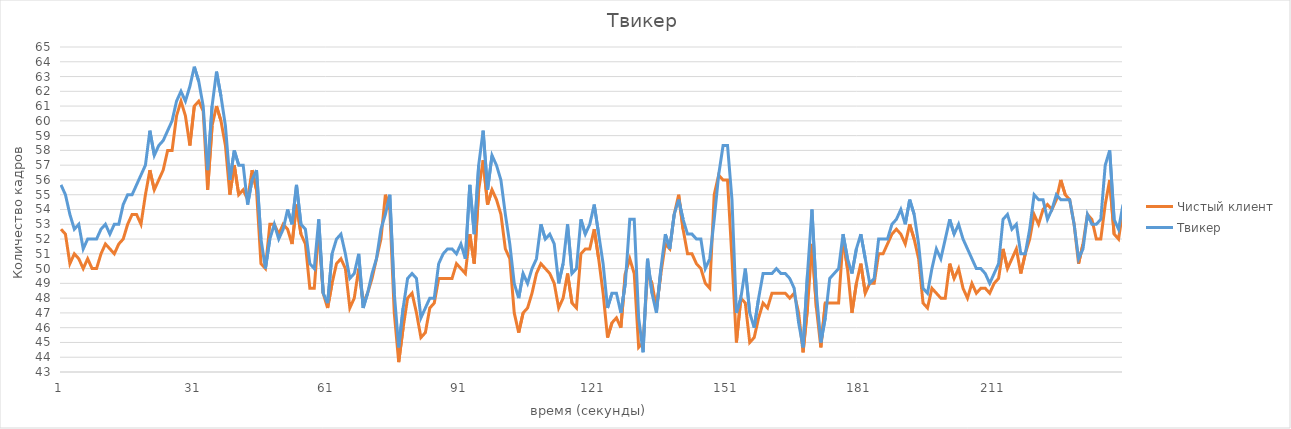
| Category | Чистый клиент | Твикер |
|---|---|---|
| 0 | 52.667 | 55.667 |
| 1 | 52.333 | 55 |
| 2 | 50.333 | 53.667 |
| 3 | 51 | 52.667 |
| 4 | 50.667 | 53 |
| 5 | 50 | 51.333 |
| 6 | 50.667 | 52 |
| 7 | 50 | 52 |
| 8 | 50 | 52 |
| 9 | 51 | 52.667 |
| 10 | 51.667 | 53 |
| 11 | 51.333 | 52.333 |
| 12 | 51 | 53 |
| 13 | 51.667 | 53 |
| 14 | 52 | 54.333 |
| 15 | 53 | 55 |
| 16 | 53.667 | 55 |
| 17 | 53.667 | 55.667 |
| 18 | 53 | 56.333 |
| 19 | 55 | 57 |
| 20 | 56.667 | 59.333 |
| 21 | 55.333 | 57.667 |
| 22 | 56 | 58.333 |
| 23 | 56.667 | 58.667 |
| 24 | 58 | 59.333 |
| 25 | 58 | 60 |
| 26 | 60.333 | 61.333 |
| 27 | 61.333 | 62 |
| 28 | 60.333 | 61.333 |
| 29 | 58.333 | 62.333 |
| 30 | 61 | 63.667 |
| 31 | 61.333 | 62.667 |
| 32 | 60.667 | 61 |
| 33 | 55.333 | 56.667 |
| 34 | 59.667 | 61 |
| 35 | 61 | 63.333 |
| 36 | 60 | 61.667 |
| 37 | 58.333 | 59.667 |
| 38 | 55 | 56 |
| 39 | 57 | 58 |
| 40 | 55 | 57 |
| 41 | 55.333 | 57 |
| 42 | 54.667 | 54.333 |
| 43 | 56.667 | 56 |
| 44 | 55.333 | 56.667 |
| 45 | 50.333 | 52 |
| 46 | 50 | 50 |
| 47 | 53 | 52 |
| 48 | 53 | 53 |
| 49 | 52.333 | 52 |
| 50 | 53 | 52.667 |
| 51 | 52.667 | 54 |
| 52 | 51.667 | 53 |
| 53 | 54.333 | 55.667 |
| 54 | 52.333 | 53 |
| 55 | 51.667 | 52.667 |
| 56 | 48.667 | 50.333 |
| 57 | 48.667 | 50 |
| 58 | 52.667 | 53.333 |
| 59 | 48.333 | 48.333 |
| 60 | 47.333 | 47.667 |
| 61 | 49 | 51 |
| 62 | 50.333 | 52 |
| 63 | 50.667 | 52.333 |
| 64 | 50 | 51 |
| 65 | 47.333 | 49.333 |
| 66 | 48 | 49.667 |
| 67 | 50 | 51 |
| 68 | 47.667 | 47.333 |
| 69 | 48.333 | 48.333 |
| 70 | 49.333 | 49.667 |
| 71 | 50.667 | 50.667 |
| 72 | 52 | 52.667 |
| 73 | 55 | 53.667 |
| 74 | 54 | 55 |
| 75 | 47 | 48.333 |
| 76 | 43.667 | 44.667 |
| 77 | 46 | 47.333 |
| 78 | 48 | 49.333 |
| 79 | 48.333 | 49.667 |
| 80 | 47 | 49.333 |
| 81 | 45.333 | 46.667 |
| 82 | 45.667 | 47.333 |
| 83 | 47.333 | 48 |
| 84 | 47.667 | 48 |
| 85 | 49.333 | 50.333 |
| 86 | 49.333 | 51 |
| 87 | 49.333 | 51.333 |
| 88 | 49.333 | 51.333 |
| 89 | 50.333 | 51 |
| 90 | 50 | 51.667 |
| 91 | 49.667 | 50.667 |
| 92 | 52.333 | 55.667 |
| 93 | 50.333 | 52.333 |
| 94 | 55.333 | 57 |
| 95 | 57.333 | 59.333 |
| 96 | 54.333 | 55.333 |
| 97 | 55.333 | 57.667 |
| 98 | 54.667 | 57 |
| 99 | 53.667 | 56 |
| 100 | 51.333 | 53.667 |
| 101 | 50.667 | 51.667 |
| 102 | 47 | 49 |
| 103 | 45.667 | 48 |
| 104 | 47 | 49.667 |
| 105 | 47.333 | 49 |
| 106 | 48.333 | 50 |
| 107 | 49.667 | 50.667 |
| 108 | 50.333 | 53 |
| 109 | 50 | 52 |
| 110 | 49.667 | 52.333 |
| 111 | 49 | 51.667 |
| 112 | 47.333 | 49 |
| 113 | 48 | 50.333 |
| 114 | 49.667 | 53 |
| 115 | 47.667 | 49.667 |
| 116 | 47.333 | 50 |
| 117 | 51 | 53.333 |
| 118 | 51.333 | 52.333 |
| 119 | 51.333 | 53 |
| 120 | 52.667 | 54.333 |
| 121 | 50.667 | 52.333 |
| 122 | 48.333 | 50.333 |
| 123 | 45.333 | 47.333 |
| 124 | 46.333 | 48.333 |
| 125 | 46.667 | 48.333 |
| 126 | 46 | 47 |
| 127 | 49.667 | 49 |
| 128 | 50.667 | 53.333 |
| 129 | 49.667 | 53.333 |
| 130 | 44.667 | 46.667 |
| 131 | 45 | 44.333 |
| 132 | 49.667 | 50.667 |
| 133 | 49 | 48.333 |
| 134 | 47.333 | 47 |
| 135 | 49.667 | 50 |
| 136 | 51.667 | 52.333 |
| 137 | 51.333 | 51.333 |
| 138 | 53.667 | 53.667 |
| 139 | 55 | 54.667 |
| 140 | 52.667 | 53.333 |
| 141 | 51 | 52.333 |
| 142 | 51 | 52.333 |
| 143 | 50.333 | 52 |
| 144 | 50 | 52 |
| 145 | 49 | 50 |
| 146 | 48.667 | 50.667 |
| 147 | 55 | 53.333 |
| 148 | 56.333 | 56.333 |
| 149 | 56 | 58.333 |
| 150 | 56 | 58.333 |
| 151 | 50.667 | 54.667 |
| 152 | 45 | 47 |
| 153 | 48 | 48 |
| 154 | 47.667 | 50 |
| 155 | 45 | 47 |
| 156 | 45.333 | 46 |
| 157 | 46.667 | 48 |
| 158 | 47.667 | 49.667 |
| 159 | 47.333 | 49.667 |
| 160 | 48.333 | 49.667 |
| 161 | 48.333 | 50 |
| 162 | 48.333 | 49.667 |
| 163 | 48.333 | 49.667 |
| 164 | 48 | 49.333 |
| 165 | 48.333 | 48.667 |
| 166 | 47 | 46.333 |
| 167 | 44.333 | 44.667 |
| 168 | 47.333 | 49.667 |
| 169 | 51.667 | 54 |
| 170 | 47.333 | 48.333 |
| 171 | 44.667 | 45 |
| 172 | 47.667 | 46.667 |
| 173 | 47.667 | 49.333 |
| 174 | 47.667 | 49.667 |
| 175 | 47.667 | 50 |
| 176 | 52 | 52.333 |
| 177 | 50 | 50.667 |
| 178 | 47 | 49.667 |
| 179 | 49 | 51.333 |
| 180 | 50.333 | 52.333 |
| 181 | 48.333 | 50.667 |
| 182 | 49 | 49 |
| 183 | 49 | 49.333 |
| 184 | 51 | 52 |
| 185 | 51 | 52 |
| 186 | 51.667 | 52 |
| 187 | 52.333 | 53 |
| 188 | 52.667 | 53.333 |
| 189 | 52.333 | 54 |
| 190 | 51.667 | 53 |
| 191 | 53 | 54.667 |
| 192 | 52 | 53.667 |
| 193 | 50.667 | 51.667 |
| 194 | 47.667 | 48.667 |
| 195 | 47.333 | 48.333 |
| 196 | 48.667 | 50 |
| 197 | 48.333 | 51.333 |
| 198 | 48 | 50.667 |
| 199 | 48 | 52 |
| 200 | 50.333 | 53.333 |
| 201 | 49.333 | 52.333 |
| 202 | 50 | 53 |
| 203 | 48.667 | 52 |
| 204 | 48 | 51.333 |
| 205 | 49 | 50.667 |
| 206 | 48.333 | 50 |
| 207 | 48.667 | 50 |
| 208 | 48.667 | 49.667 |
| 209 | 48.333 | 49 |
| 210 | 49 | 49.667 |
| 211 | 49.333 | 50.333 |
| 212 | 51.333 | 53.333 |
| 213 | 50 | 53.667 |
| 214 | 50.667 | 52.667 |
| 215 | 51.333 | 53 |
| 216 | 49.667 | 51 |
| 217 | 51 | 51 |
| 218 | 52 | 52.667 |
| 219 | 53.667 | 55 |
| 220 | 53 | 54.667 |
| 221 | 54 | 54.667 |
| 222 | 54.333 | 53.333 |
| 223 | 54 | 54 |
| 224 | 54.667 | 55 |
| 225 | 56 | 54.667 |
| 226 | 55 | 54.667 |
| 227 | 54.667 | 54.667 |
| 228 | 53 | 53 |
| 229 | 50.333 | 50.667 |
| 230 | 51.667 | 51.333 |
| 231 | 53.667 | 53.667 |
| 232 | 53.333 | 53 |
| 233 | 52 | 53 |
| 234 | 52 | 53.333 |
| 235 | 54.333 | 57 |
| 236 | 56 | 58 |
| 237 | 52.333 | 53.333 |
| 238 | 52 | 52.667 |
| 239 | 54 | 54.333 |